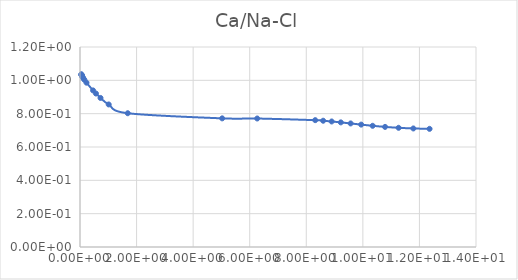
| Category | Series 0 |
|---|---|
| 0.045799 | 1.036 |
| 0.050887 | 1.034 |
| 0.057261 | 1.031 |
| 0.065458 | 1.028 |
| 0.076373 | 1.025 |
| 0.091688 | 1.02 |
| 0.11464 | 1.013 |
| 0.15299 | 1.003 |
| 0.22973 | 0.986 |
| 0.46172 | 0.939 |
| 0.56419 | 0.921 |
| 0.72511 | 0.894 |
| 1.0144 | 0.855 |
| 1.688 | 0.803 |
| 5.0263 | 0.772 |
| 6.2654 | 0.771 |
| 8.3152 | 0.761 |
| 8.5965 | 0.758 |
| 8.8974 | 0.753 |
| 9.2202 | 0.748 |
| 9.5673 | 0.741 |
| 9.9415 | 0.734 |
| 10.346 | 0.727 |
| 10.785 | 0.721 |
| 11.263 | 0.715 |
| 11.785 | 0.711 |
| 12.358 | 0.709 |